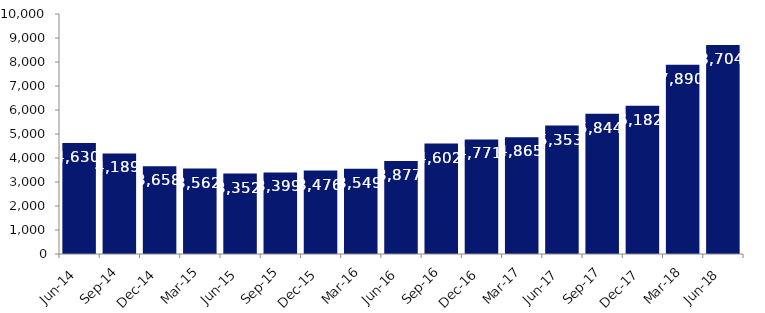
| Category | Series 0 |
|---|---|
| Jun-14 | 4630 |
| Sep-14 | 4189 |
| Dec-14 | 3658 |
| Mar-15 | 3562 |
| Jun-15 | 3352 |
| Sep-15 | 3399 |
| Dec-15 | 3476 |
| Mar-16 | 3549 |
| Jun-16 | 3877 |
| Sep-16 | 4602 |
| Dec-16 | 4771 |
| Mar-17 | 4865 |
| Jun-17 | 5353 |
| Sep-17 | 5844 |
| Dec-17 | 6182 |
| Mar-18 | 7890 |
| Jun-18 | 8704 |